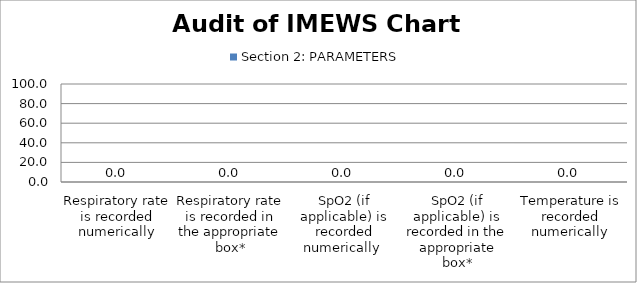
| Category | Section 2: PARAMETERS |
|---|---|
| Respiratory rate is recorded numerically | 0 |
| Respiratory rate is recorded in the appropriate box* | 0 |
| SpO2 (if applicable) is recorded numerically  | 0 |
| SpO2 (if applicable) is recorded in the appropriate box* | 0 |
| Temperature is recorded numerically | 0 |